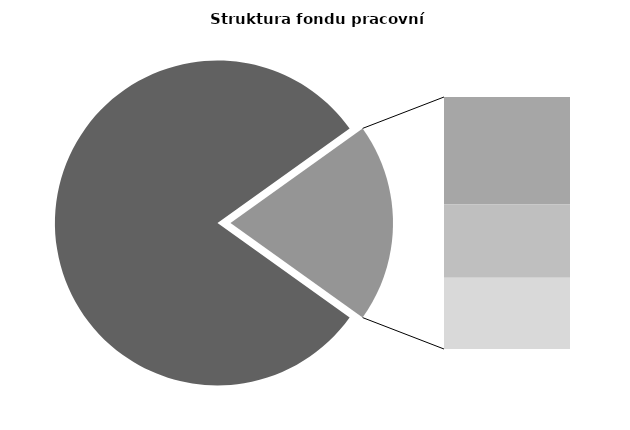
| Category | Series 0 |
|---|---|
| Průměrná měsíční odpracovaná doba bez přesčasu | 136.8 |
| Dovolená | 14.341 |
| Nemoc | 9.86 |
| Jiné | 9.53 |